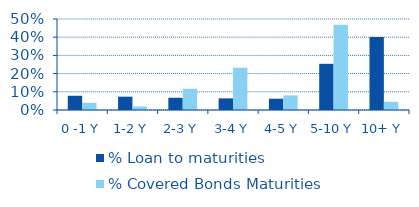
| Category | % Loan to maturities | % Covered Bonds Maturities |
|---|---|---|
| 0 -1 Y | 0.078 | 0.039 |
| 1-2 Y | 0.073 | 0.019 |
| 2-3 Y | 0.067 | 0.116 |
| 3-4 Y | 0.064 | 0.232 |
| 4-5 Y | 0.062 | 0.08 |
| 5-10 Y | 0.254 | 0.468 |
| 10+ Y | 0.402 | 0.045 |